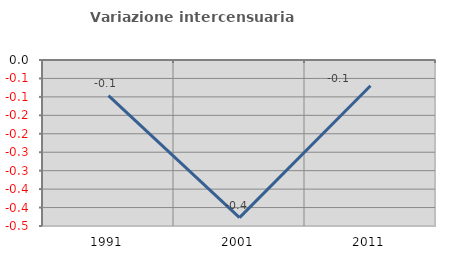
| Category | Variazione intercensuaria annua |
|---|---|
| 1991.0 | -0.097 |
| 2001.0 | -0.427 |
| 2011.0 | -0.07 |